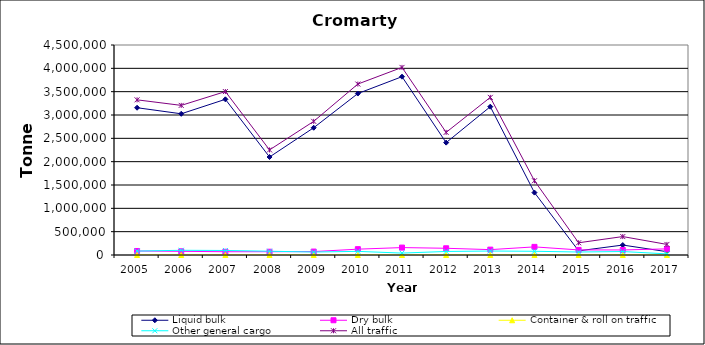
| Category | Liquid bulk | Dry bulk | Container & roll on traffic | Other general cargo | All traffic |
|---|---|---|---|---|---|
| 2005.0 | 3156000 | 86000 | 0 | 84000 | 3325000 |
| 2006.0 | 3026000 | 79000 | 0 | 101000 | 3206000 |
| 2007.0 | 3336000 | 70000 | 0 | 97000 | 3502000 |
| 2008.0 | 2100000 | 70000 | 0 | 81000 | 2252000 |
| 2009.0 | 2726958 | 73490 | 0 | 63591 | 2864039 |
| 2010.0 | 3460000 | 125000 | 0 | 78000 | 3663000 |
| 2011.0 | 3821000 | 159000 | 0 | 41000 | 4020000 |
| 2012.0 | 2408000 | 144000 | 0 | 76000 | 2628000 |
| 2013.0 | 3178000 | 115000 | 0 | 85000 | 3378000 |
| 2014.0 | 1337000 | 174000 | 0 | 80000 | 1591000 |
| 2015.0 | 89000 | 109000 | 0 | 64000 | 262000 |
| 2016.0 | 213000 | 108000 | 0 | 74000 | 395000 |
| 2017.0 | 71000 | 131000 | 0 | 24000 | 227000 |